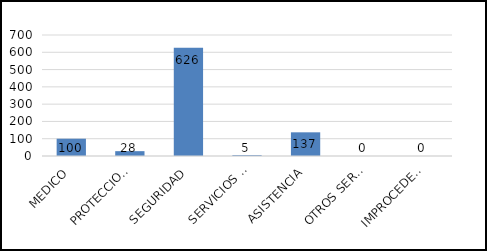
| Category | TOTAL |
|---|---|
| MEDICO | 100 |
| PROTECCION CIVIL | 28 |
| SEGURIDAD | 626 |
| SERVICIOS PUBLICOS | 5 |
| ASISTENCIA | 137 |
| OTROS SERVICIOS | 0 |
| IMPROCEDENTES | 0 |